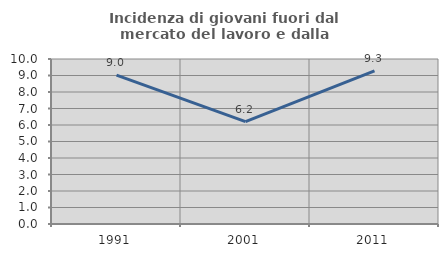
| Category | Incidenza di giovani fuori dal mercato del lavoro e dalla formazione  |
|---|---|
| 1991.0 | 9.019 |
| 2001.0 | 6.201 |
| 2011.0 | 9.281 |